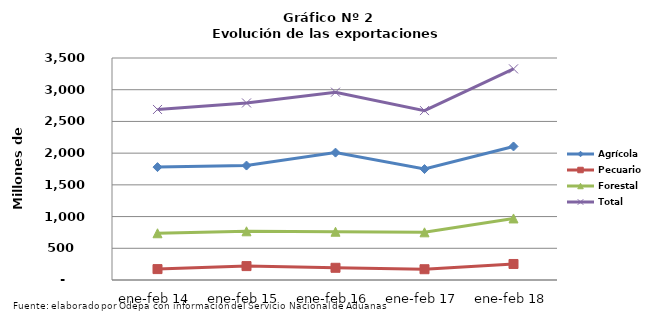
| Category | Agrícola | Pecuario | Forestal | Total |
|---|---|---|---|---|
| ene-feb 14 | 1779687 | 171935 | 737036 | 2688658 |
| ene-feb 15 | 1804365 | 219124 | 767885 | 2791374 |
| ene-feb 16 | 2008179 | 192480 | 760756 | 2961415 |
| ene-feb 17 | 1749042 | 169875 | 751657 | 2670574 |
| ene-feb 18 | 2105368 | 252572 | 970374 | 3328314 |